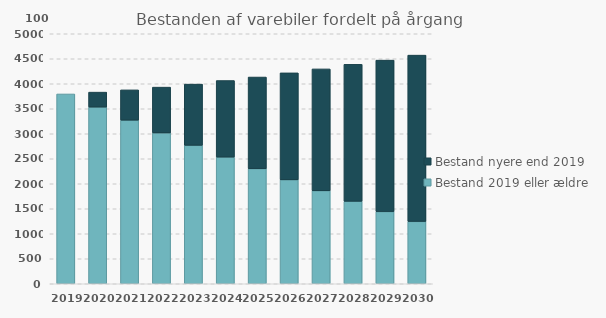
| Category | Bestand 2019 eller ældre | Bestand nyere end 2019 |
|---|---|---|
| 2019 | 3796 | 0 |
| 2020 | 3534 | 299 |
| 2021 | 3272 | 606 |
| 2022 | 3017 | 916 |
| 2023 | 2769 | 1224 |
| 2024 | 2533 | 1532 |
| 2025 | 2302 | 1833 |
| 2026 | 2079 | 2139 |
| 2027 | 1860 | 2437 |
| 2028 | 1650 | 2739 |
| 2029 | 1443 | 3030 |
| 2030 | 1247 | 3326 |